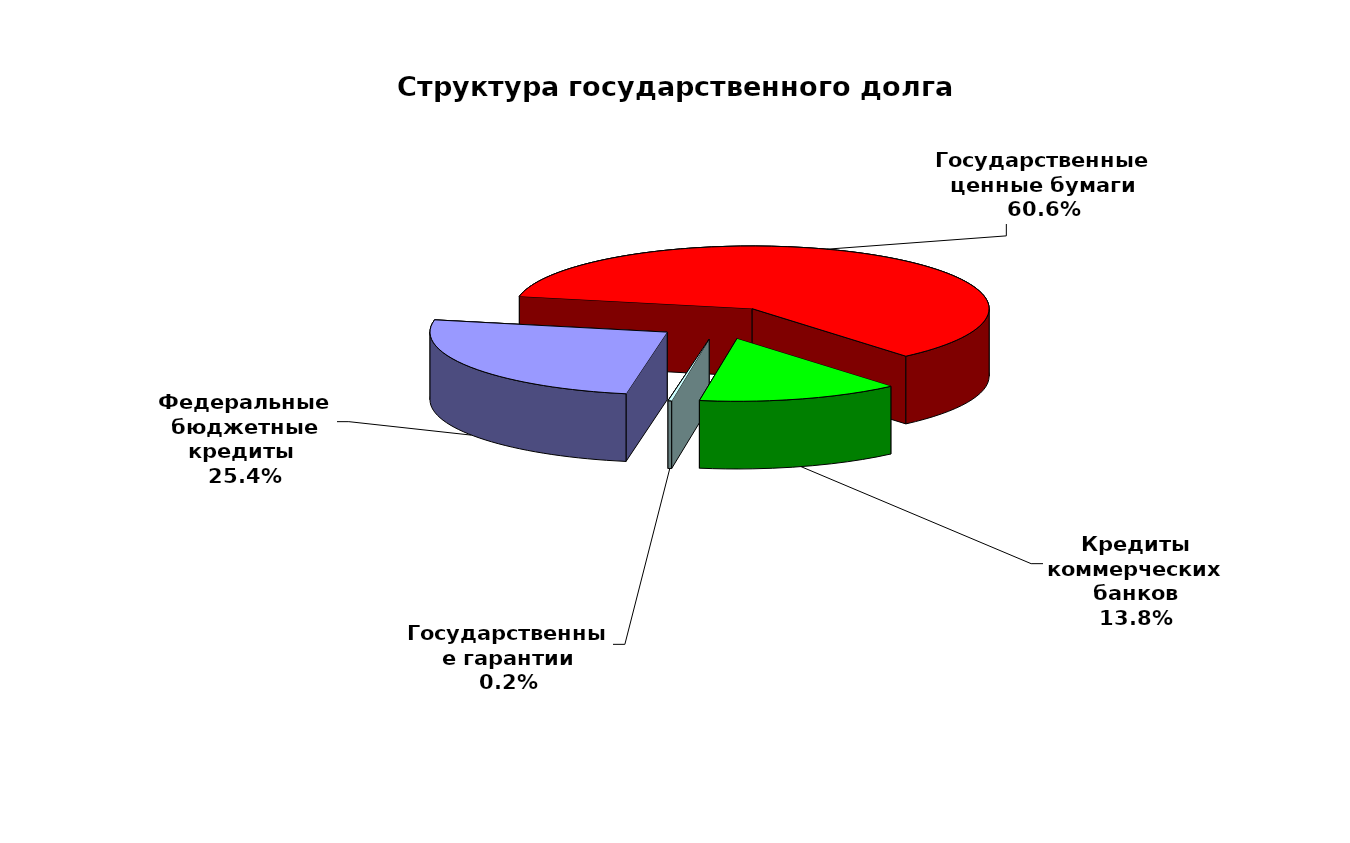
| Category | Series 0 |
|---|---|
| Федеральные бюджетные кредиты  | 18954967.363 |
| Государственные ценные бумаги | 45300000 |
| Кредиты коммерческих банков | 10291177 |
| Государственные гарантии | 186330.02 |